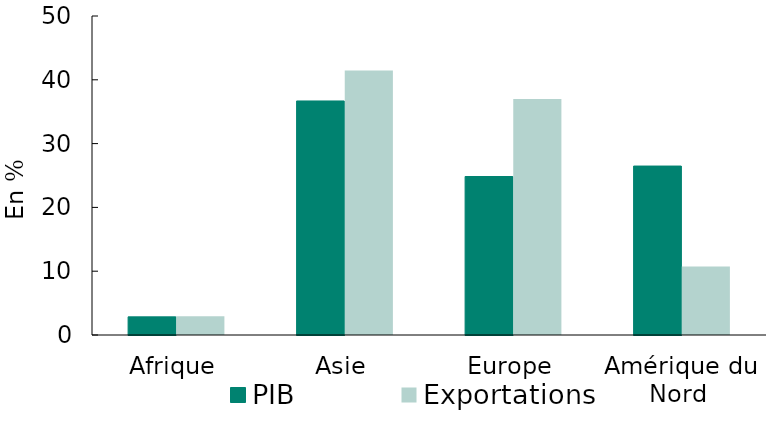
| Category | PIB | Exportations |
|---|---|---|
| Afrique | 2.841 | 2.958 |
| Asie | 36.682 | 41.442 |
| Europe | 24.841 | 36.978 |
| Amérique du Nord  | 26.481 | 10.751 |